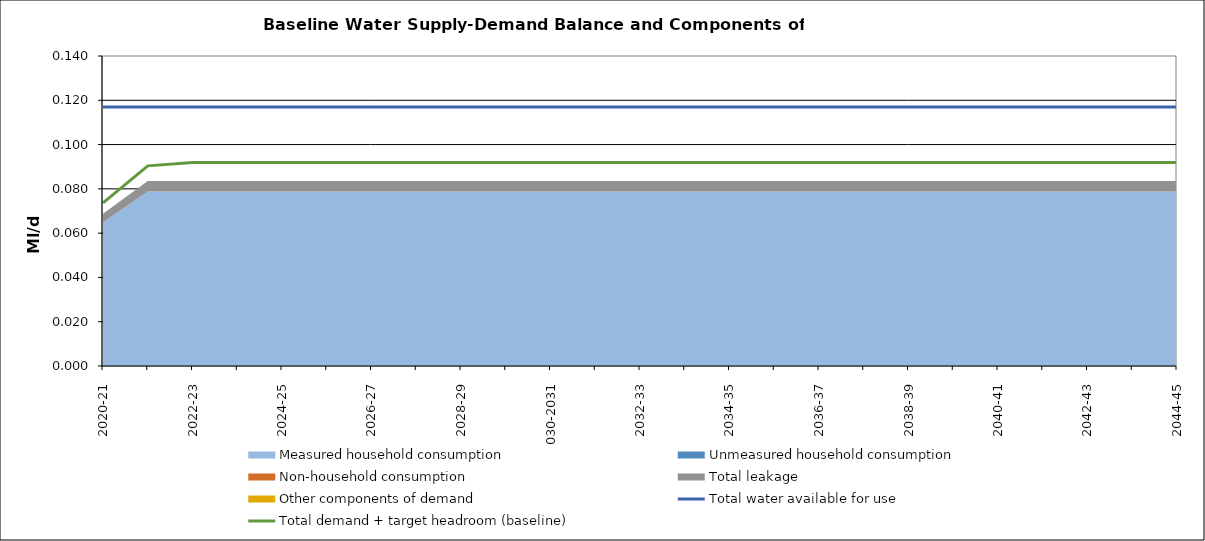
| Category | Total water available for use | Total demand + target headroom (baseline) |
|---|---|---|
| 0 | 0.117 | 0.074 |
| 1 | 0.117 | 0.09 |
| 2 | 0.117 | 0.092 |
| 3 | 0.117 | 0.092 |
| 4 | 0.117 | 0.092 |
| 5 | 0.117 | 0.092 |
| 6 | 0.117 | 0.092 |
| 7 | 0.117 | 0.092 |
| 8 | 0.117 | 0.092 |
| 9 | 0.117 | 0.092 |
| 10 | 0.117 | 0.092 |
| 11 | 0.117 | 0.092 |
| 12 | 0.117 | 0.092 |
| 13 | 0.117 | 0.092 |
| 14 | 0.117 | 0.092 |
| 15 | 0.117 | 0.092 |
| 16 | 0.117 | 0.092 |
| 17 | 0.117 | 0.092 |
| 18 | 0.117 | 0.092 |
| 19 | 0.117 | 0.092 |
| 20 | 0.117 | 0.092 |
| 21 | 0.117 | 0.092 |
| 22 | 0.117 | 0.092 |
| 23 | 0.117 | 0.092 |
| 24 | 0.117 | 0.092 |